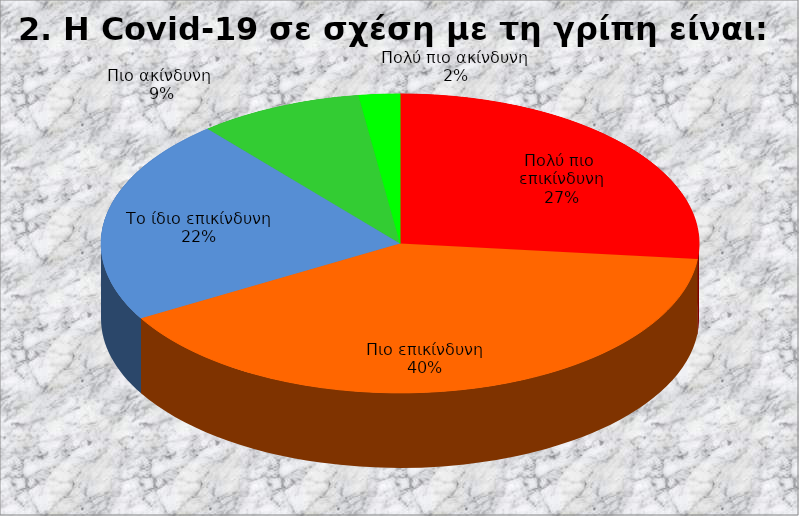
| Category | Series 0 |
|---|---|
| Πολύ πιο  επικίνδυνη | 12 |
| Πιο επικίνδυνη | 18 |
| Το ίδιο επικίνδυνη | 10 |
| Πιο ακίνδυνη  | 4 |
| Πολύ πιο ακίνδυνη | 1 |